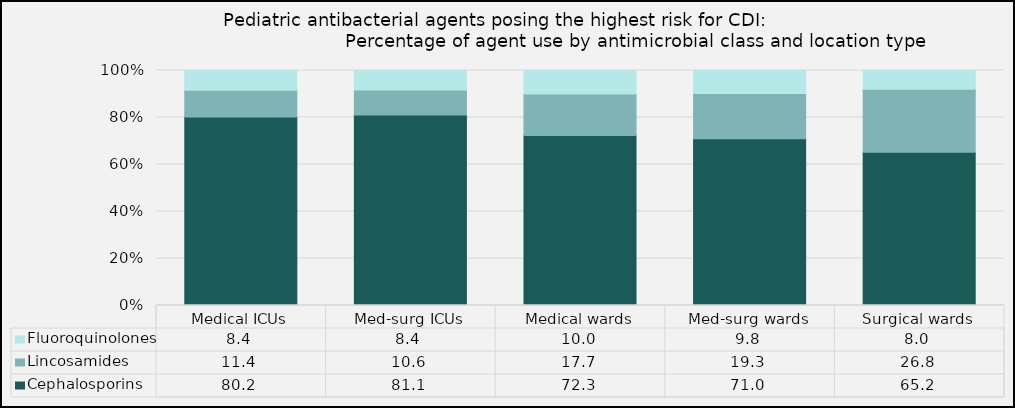
| Category | Cephalosporins | Lincosamides | Fluoroquinolones |
|---|---|---|---|
| Medical ICUs | 80.21 | 11.37 | 8.43 |
| Med-surg ICUs | 81.06 | 10.58 | 8.35 |
| Medical wards | 72.29 | 17.67 | 10.04 |
| Med-surg wards | 70.97 | 19.26 | 9.77 |
| Surgical wards | 65.18 | 26.8 | 8.02 |